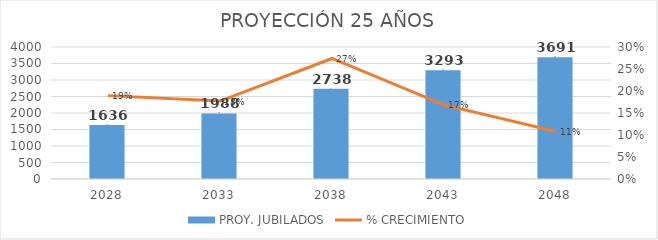
| Category | PROY. JUBILADOS |
|---|---|
| 2028.0 | 1636 |
| 2033.0 | 1988 |
| 2038.0 | 2738 |
| 2043.0 | 3293 |
| 2048.0 | 3691 |